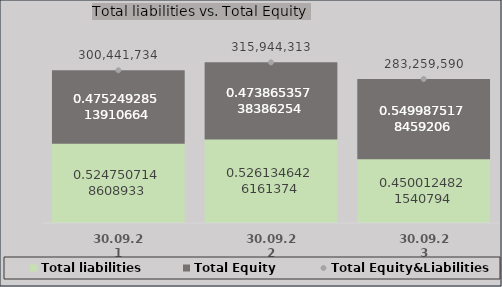
| Category | Total liabilities | Total Equity |
|---|---|---|
| 30.09.21 | 157657014.433 | 142784719.076 |
| 30.09.22 | 166229248.422 | 149715064.987 |
| 30.09.23 | 127470351 | 155789238.578 |